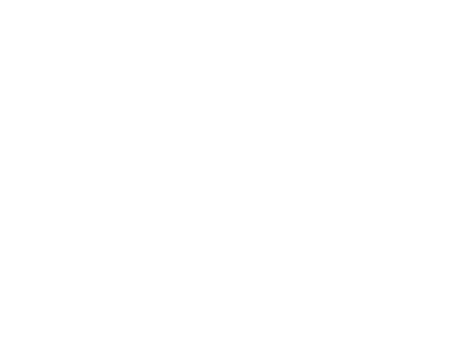
| Category | קרן ששולמה | ריבית ששולמה |
|---|---|---|
| 2020 | 380.494 | 270.663 |
| 2021 | 1173.53 | 779.943 |
| 2022 | 2011.299 | 1244.49 |
| 2023 | 2896.325 | 1661.779 |
| 2024 | 3831.273 | 2029.146 |
| 2025 | 4818.959 | 2343.775 |
| 2026 | 5862.359 | 2602.69 |
| 2027 | 6964.615 | 2802.75 |
| 2028 | 8129.047 | 2940.634 |
| 2029 | 9359.162 | 3012.834 |
| 2030 | 10000 | 3023.153 |